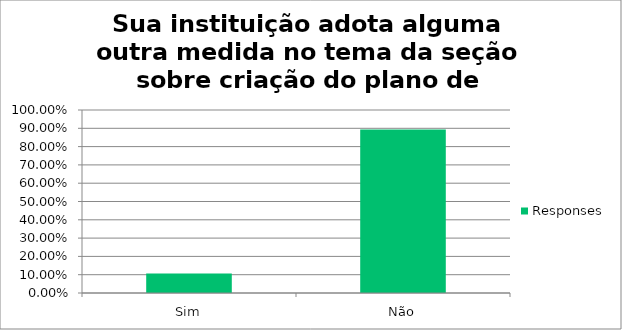
| Category | Responses |
|---|---|
| Sim | 0.106 |
| Não | 0.894 |